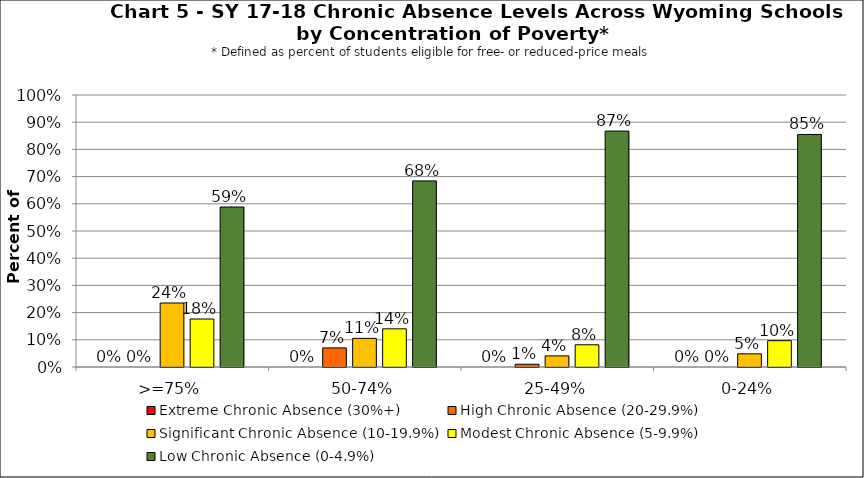
| Category | Extreme Chronic Absence (30%+) | High Chronic Absence (20-29.9%) | Significant Chronic Absence (10-19.9%) | Modest Chronic Absence (5-9.9%) | Low Chronic Absence (0-4.9%) |
|---|---|---|---|---|---|
| 0 | 0 | 0 | 0.235 | 0.176 | 0.588 |
| 1 | 0 | 0.07 | 0.105 | 0.14 | 0.684 |
| 2 | 0 | 0.01 | 0.041 | 0.082 | 0.867 |
| 3 | 0 | 0 | 0.048 | 0.097 | 0.855 |